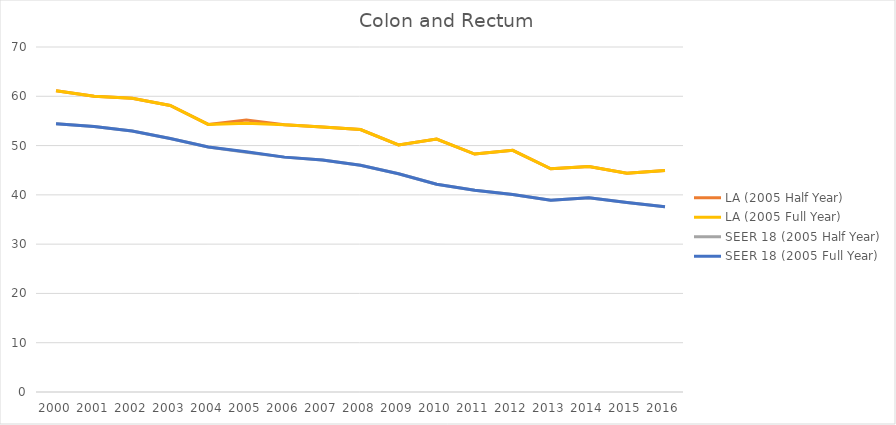
| Category | LA (2005 Half Year) | LA (2005 Full Year) | SEER 18 (2005 Half Year) | SEER 18 (2005 Full Year) |
|---|---|---|---|---|
| 2000.0 | 61.135 | 61.135 | 54.44 | 54.44 |
| 2001.0 | 60.007 | 60.007 | 53.875 | 53.875 |
| 2002.0 | 59.612 | 59.612 | 52.959 | 52.959 |
| 2003.0 | 58.141 | 58.141 | 51.445 | 51.445 |
| 2004.0 | 54.284 | 54.284 | 49.711 | 49.711 |
| 2005.0 | 55.187 | 54.537 | 48.63 | 48.77 |
| 2006.0 | 54.212 | 54.212 | 47.655 | 47.655 |
| 2007.0 | 53.759 | 53.759 | 47.079 | 47.079 |
| 2008.0 | 53.248 | 53.248 | 46.015 | 46.015 |
| 2009.0 | 50.119 | 50.119 | 44.287 | 44.287 |
| 2010.0 | 51.324 | 51.324 | 42.162 | 42.162 |
| 2011.0 | 48.277 | 48.277 | 40.933 | 40.933 |
| 2012.0 | 49.045 | 49.045 | 40.092 | 40.092 |
| 2013.0 | 45.288 | 45.288 | 38.887 | 38.887 |
| 2014.0 | 45.73 | 45.73 | 39.389 | 39.389 |
| 2015.0 | 44.407 | 44.407 | 38.445 | 38.445 |
| 2016.0 | 44.964 | 44.964 | 37.595 | 37.595 |